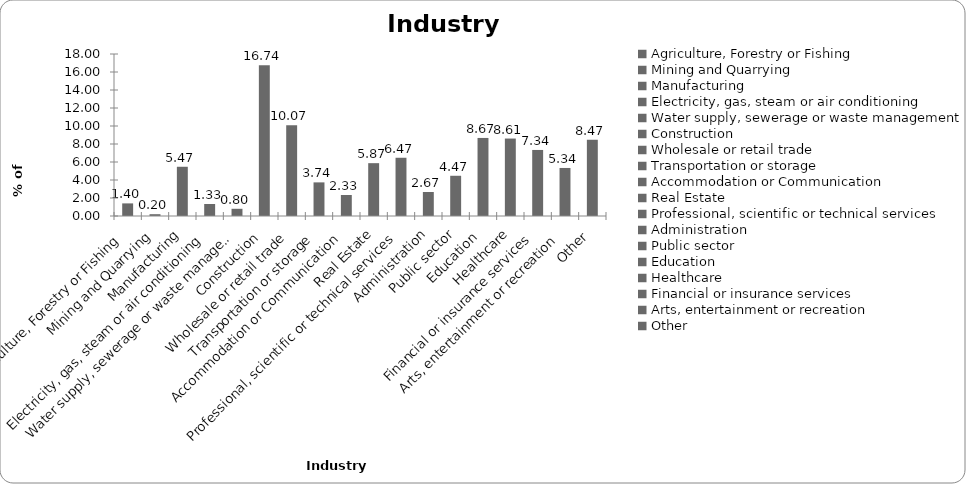
| Category | Series 0 |
|---|---|
| Agriculture, Forestry or Fishing | 1.401 |
| Mining and Quarrying | 0.2 |
| Manufacturing | 5.47 |
| Electricity, gas, steam or air conditioning | 1.334 |
| Water supply, sewerage or waste management | 0.801 |
| Construction | 16.744 |
| Wholesale or retail trade | 10.073 |
| Transportation or storage | 3.736 |
| Accommodation or Communication | 2.335 |
| Real Estate | 5.871 |
| Professional, scientific or technical services | 6.471 |
| Administration | 2.668 |
| Public sector | 4.47 |
| Education | 8.672 |
| Healthcare | 8.606 |
| Financial or insurance services | 7.338 |
| Arts, entertainment or recreation | 5.337 |
| Other | 8.472 |